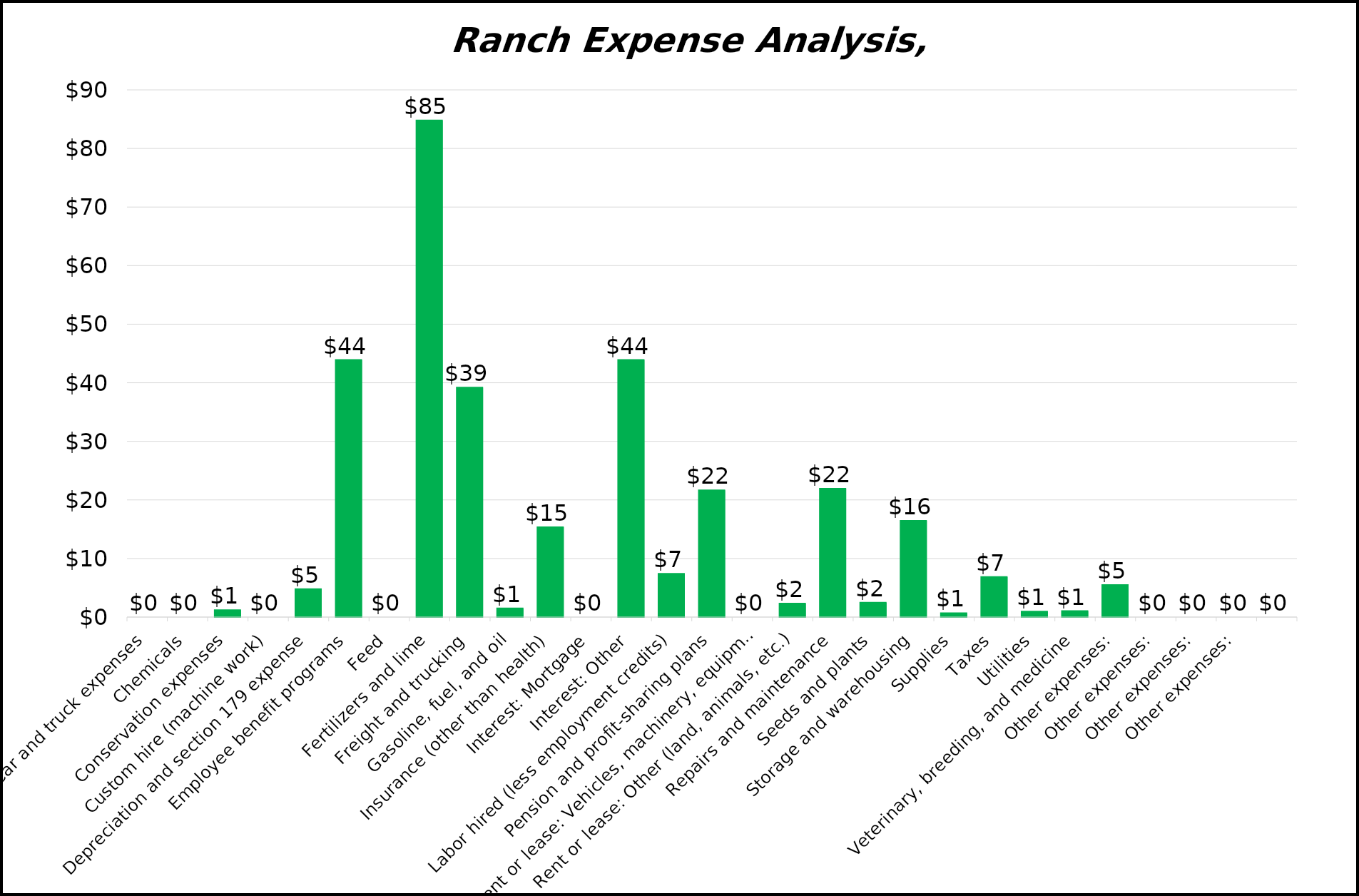
| Category | $/beef cow |
|---|---|
| Car and truck expenses | 0 |
| Chemicals | 0 |
| Conservation expenses | 1.192 |
| Custom hire (machine work) | 0 |
| Depreciation and section 179 expense | 4.795 |
| Employee benefit programs | 43.89 |
| Feed | 0 |
| Fertilizers and lime | 84.784 |
| Freight and trucking | 39.178 |
| Gasoline, fuel, and oil | 1.479 |
| Insurance (other than health) | 15.342 |
| Interest: Mortgage | 0 |
| Interest: Other | 43.89 |
| Labor hired (less employment credits) | 7.384 |
| Pension and profit-sharing plans | 21.644 |
| Rent or lease: Vehicles, machinery, equipment | 0 |
| Rent or lease: Other (land, animals, etc.) | 2.329 |
| Repairs and maintenance | 21.918 |
| Seeds and plants | 2.466 |
| Storage and warehousing | 16.438 |
| Supplies | 0.685 |
| Taxes | 6.849 |
| Utilities | 0.959 |
| Veterinary, breeding, and medicine | 1.027 |
| Other expenses: | 5.479 |
| Other expenses: | 0 |
| Other expenses: | 0 |
| Other expenses: | 0 |